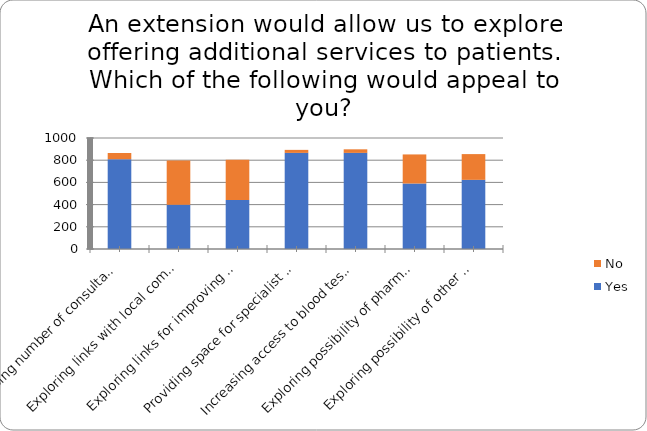
| Category | Yes | No |
|---|---|---|
| Increasing number of consultation rooms | 809 | 56 |
| Exploring links with local community groups (e.g. work with a community garden) | 398 | 399 |
| Exploring links for improving physical activity (e.g. exercise equipment or local park-run) | 442 | 363 |
| Providing space for specialist clinics/testing facilities that are currently run at other sites including hospitals and other clinics | 866 | 27 |
| Increasing access to blood tests at the surgery | 866 | 32 |
| Exploring possibility of pharmacy facilities on-site | 590 | 262 |
| Exploring possibility of other healthcare provider onsite (e.g. Dentist) | 623 | 232 |